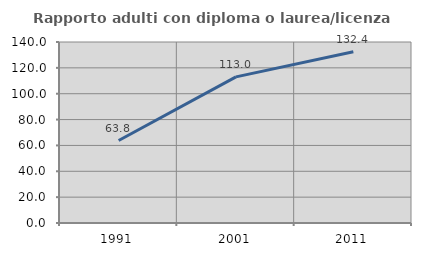
| Category | Rapporto adulti con diploma o laurea/licenza media  |
|---|---|
| 1991.0 | 63.788 |
| 2001.0 | 113.028 |
| 2011.0 | 132.413 |